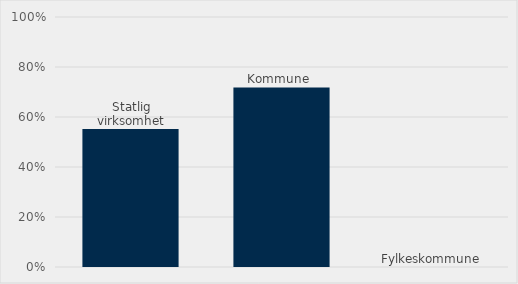
| Category | Estimert verdi som har miljø som tildelingskriterium (%) |
|---|---|
| Statlig virksomhet | 0.552 |
| Kommune  | 0.718 |
| Fylkeskommune | 0 |